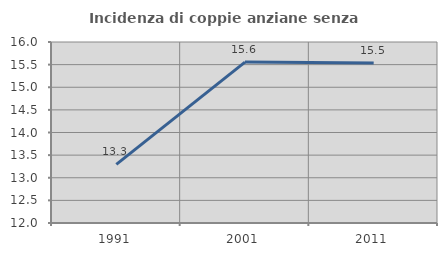
| Category | Incidenza di coppie anziane senza figli  |
|---|---|
| 1991.0 | 13.296 |
| 2001.0 | 15.556 |
| 2011.0 | 15.534 |